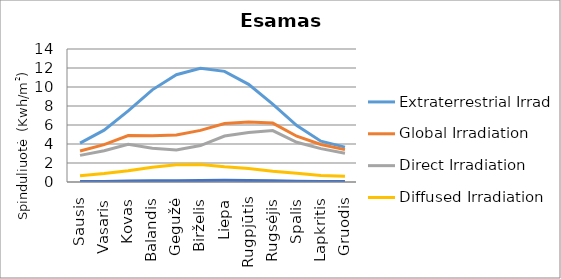
| Category | Extraterrestrial Irrad. | Global Irradiation | Direct Irradiation | Diffused Irradiation | Reflected Irradiation |
|---|---|---|---|---|---|
| Sausis | 4.099 | 3.269 | 2.802 | 0.669 | 0.047 |
| Vasaris | 5.457 | 3.937 | 3.287 | 0.885 | 0.066 |
| Kovas | 7.483 | 4.884 | 3.97 | 1.188 | 0.098 |
| Balandis | 9.7 | 4.858 | 3.545 | 1.564 | 0.12 |
| Gegužė | 11.288 | 4.94 | 3.36 | 1.815 | 0.142 |
| Birželis | 11.966 | 5.433 | 3.836 | 1.843 | 0.168 |
| Liepa | 11.647 | 6.156 | 4.84 | 1.601 | 0.185 |
| Rugpjūtis | 10.284 | 6.32 | 5.22 | 1.419 | 0.163 |
| Rugsėjis | 8.19 | 6.202 | 5.408 | 1.137 | 0.129 |
| Spalis | 5.94 | 4.817 | 4.178 | 0.925 | 0.082 |
| Lapkritis | 4.3 | 3.955 | 3.516 | 0.685 | 0.056 |
| Gruodis | 3.675 | 3.41 | 3.031 | 0.594 | 0.045 |